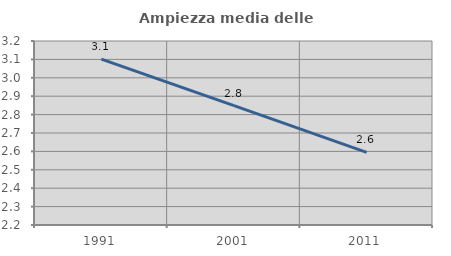
| Category | Ampiezza media delle famiglie |
|---|---|
| 1991.0 | 3.101 |
| 2001.0 | 2.849 |
| 2011.0 | 2.594 |